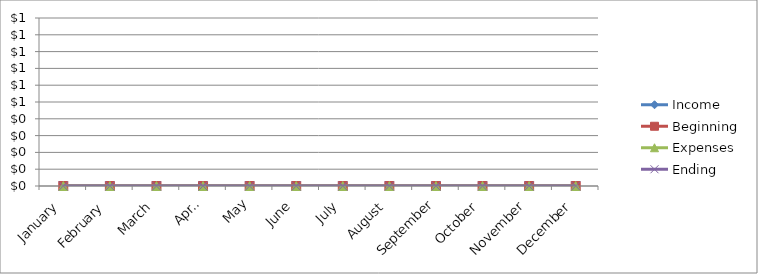
| Category | Income | Beginning | Expenses | Ending |
|---|---|---|---|---|
| January | 0 | 0 | 0 | 0 |
| February | 0 | 0 | 0 | 0 |
| March | 0 | 0 | 0 | 0 |
| April | 0 | 0 | 0 | 0 |
| May | 0 | 0 | 0 | 0 |
| June | 0 | 0 | 0 | 0 |
| July | 0 | 0 | 0 | 0 |
| August | 0 | 0 | 0 | 0 |
| September | 0 | 0 | 0 | 0 |
| October | 0 | 0 | 0 | 0 |
| November | 0 | 0 | 0 | 0 |
| December | 0 | 0 | 0 | 0 |